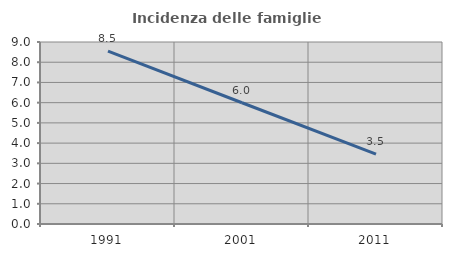
| Category | Incidenza delle famiglie numerose |
|---|---|
| 1991.0 | 8.544 |
| 2001.0 | 5.997 |
| 2011.0 | 3.454 |